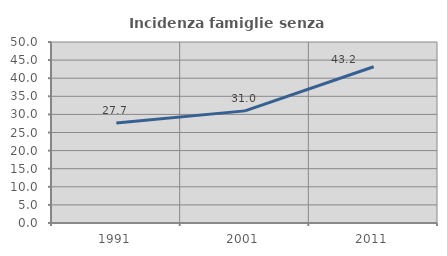
| Category | Incidenza famiglie senza nuclei |
|---|---|
| 1991.0 | 27.652 |
| 2001.0 | 30.973 |
| 2011.0 | 43.159 |